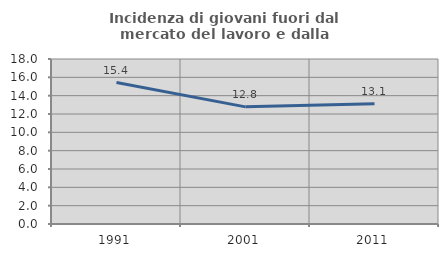
| Category | Incidenza di giovani fuori dal mercato del lavoro e dalla formazione  |
|---|---|
| 1991.0 | 15.433 |
| 2001.0 | 12.777 |
| 2011.0 | 13.124 |